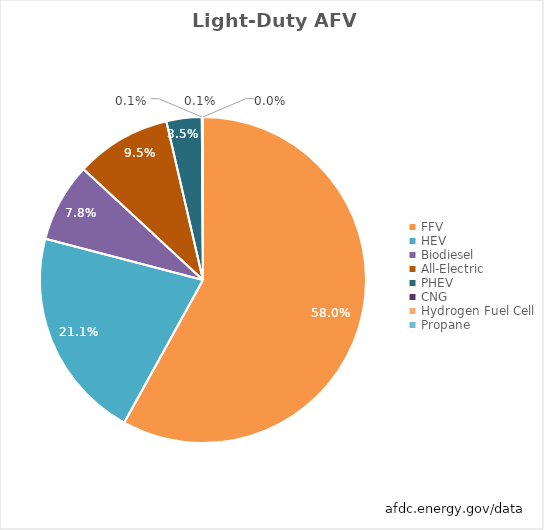
| Category | Series 0 |
|---|---|
| FFV | 19000000 |
| HEV | 6890000 |
| Biodiesel | 2563000 |
| All-Electric | 3105000 |
| PHEV | 1144000 |
| CNG | 17000 |
| Hydrogen Fuel Cell | 16000 |
| Propane | 6000 |